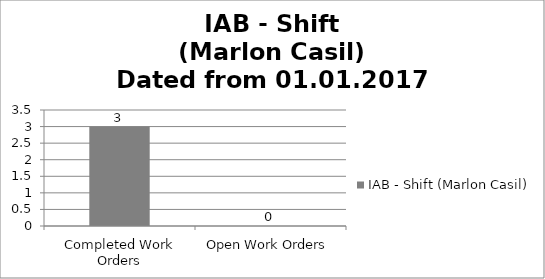
| Category | IAB - Shift (Marlon Casil) |
|---|---|
| Completed Work Orders | 3 |
| Open Work Orders | 0 |